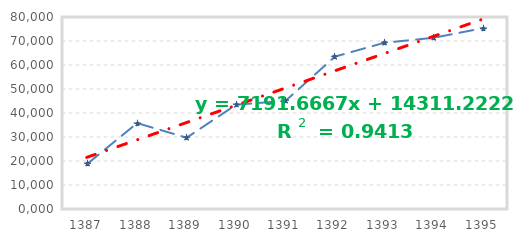
| Category | درآمد (میلیون ریال) |
|---|---|
| 1387.0 | 18954 |
| 1388.0 | 35788 |
| 1389.0 | 29708 |
| 1390.0 | 43445 |
| 1391.0 | 45055 |
| 1392.0 | 63495 |
| 1393.0 | 69262 |
| 1394.0 | 71354 |
| 1395.0 | 75365 |